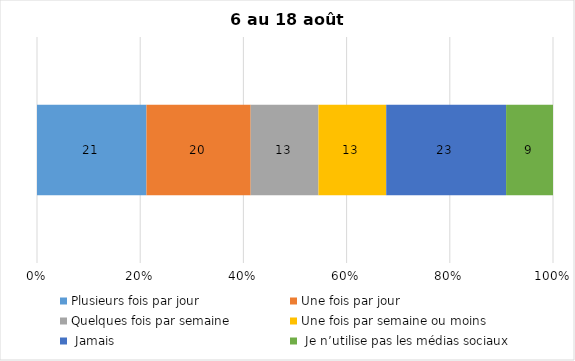
| Category | Plusieurs fois par jour | Une fois par jour | Quelques fois par semaine   | Une fois par semaine ou moins   |  Jamais   |  Je n’utilise pas les médias sociaux |
|---|---|---|---|---|---|---|
| 0 | 21 | 20 | 13 | 13 | 23 | 9 |